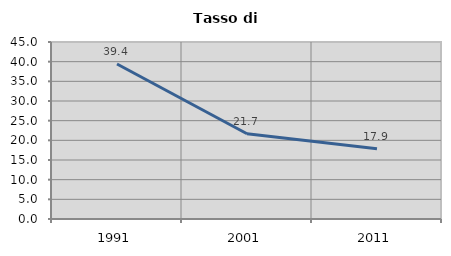
| Category | Tasso di disoccupazione   |
|---|---|
| 1991.0 | 39.398 |
| 2001.0 | 21.685 |
| 2011.0 | 17.869 |